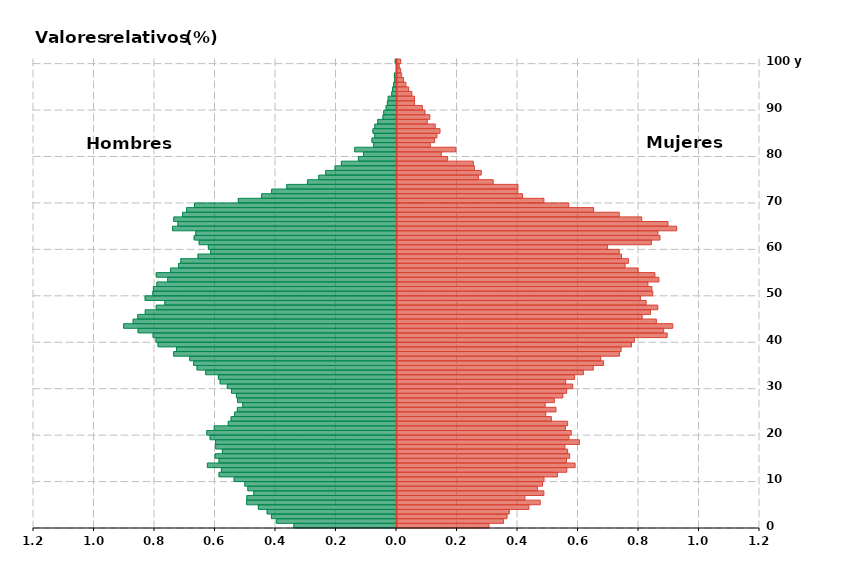
| Category | Hombres | Mujeres |
|---|---|---|
| 0 | -0.339 | 0.304 |
| 1 | -0.397 | 0.352 |
| 2 | -0.413 | 0.364 |
| 3 | -0.428 | 0.371 |
| 4 | -0.457 | 0.436 |
| 5 | -0.496 | 0.473 |
| 6 | -0.494 | 0.423 |
| 7 | -0.472 | 0.486 |
| 8 | -0.491 | 0.464 |
| 9 | -0.501 | 0.481 |
| 10 | -0.537 | 0.486 |
| 11 | -0.587 | 0.53 |
| 12 | -0.579 | 0.561 |
| 13 | -0.625 | 0.589 |
| 14 | -0.587 | 0.56 |
| 15 | -0.6 | 0.571 |
| 16 | -0.576 | 0.564 |
| 17 | -0.598 | 0.555 |
| 18 | -0.598 | 0.603 |
| 19 | -0.616 | 0.568 |
| 20 | -0.627 | 0.576 |
| 21 | -0.602 | 0.557 |
| 22 | -0.556 | 0.564 |
| 23 | -0.547 | 0.51 |
| 24 | -0.535 | 0.492 |
| 25 | -0.526 | 0.526 |
| 26 | -0.508 | 0.49 |
| 27 | -0.526 | 0.52 |
| 28 | -0.529 | 0.548 |
| 29 | -0.546 | 0.561 |
| 30 | -0.559 | 0.581 |
| 31 | -0.583 | 0.558 |
| 32 | -0.589 | 0.587 |
| 33 | -0.631 | 0.616 |
| 34 | -0.659 | 0.649 |
| 35 | -0.67 | 0.683 |
| 36 | -0.684 | 0.674 |
| 37 | -0.737 | 0.736 |
| 38 | -0.727 | 0.741 |
| 39 | -0.788 | 0.775 |
| 40 | -0.795 | 0.785 |
| 41 | -0.805 | 0.893 |
| 42 | -0.854 | 0.882 |
| 43 | -0.902 | 0.912 |
| 44 | -0.87 | 0.857 |
| 45 | -0.855 | 0.81 |
| 46 | -0.83 | 0.838 |
| 47 | -0.794 | 0.862 |
| 48 | -0.766 | 0.824 |
| 49 | -0.831 | 0.805 |
| 50 | -0.806 | 0.846 |
| 51 | -0.804 | 0.843 |
| 52 | -0.792 | 0.829 |
| 53 | -0.756 | 0.866 |
| 54 | -0.794 | 0.853 |
| 55 | -0.747 | 0.797 |
| 56 | -0.72 | 0.754 |
| 57 | -0.713 | 0.765 |
| 58 | -0.656 | 0.742 |
| 59 | -0.615 | 0.735 |
| 60 | -0.622 | 0.696 |
| 61 | -0.652 | 0.841 |
| 62 | -0.669 | 0.869 |
| 63 | -0.664 | 0.863 |
| 64 | -0.74 | 0.925 |
| 65 | -0.723 | 0.896 |
| 66 | -0.736 | 0.809 |
| 67 | -0.707 | 0.735 |
| 68 | -0.694 | 0.65 |
| 69 | -0.668 | 0.568 |
| 70 | -0.523 | 0.486 |
| 71 | -0.446 | 0.415 |
| 72 | -0.413 | 0.399 |
| 73 | -0.363 | 0.4 |
| 74 | -0.294 | 0.318 |
| 75 | -0.257 | 0.269 |
| 76 | -0.234 | 0.279 |
| 77 | -0.203 | 0.256 |
| 78 | -0.182 | 0.252 |
| 79 | -0.126 | 0.167 |
| 80 | -0.109 | 0.146 |
| 81 | -0.138 | 0.194 |
| 82 | -0.075 | 0.11 |
| 83 | -0.081 | 0.124 |
| 84 | -0.072 | 0.132 |
| 85 | -0.078 | 0.142 |
| 86 | -0.072 | 0.126 |
| 87 | -0.062 | 0.1 |
| 88 | -0.045 | 0.108 |
| 89 | -0.042 | 0.093 |
| 90 | -0.034 | 0.084 |
| 91 | -0.03 | 0.058 |
| 92 | -0.027 | 0.058 |
| 93 | -0.016 | 0.049 |
| 94 | -0.013 | 0.038 |
| 95 | -0.009 | 0.029 |
| 96 | -0.006 | 0.022 |
| 97 | -0.007 | 0.015 |
| 98 | -0.001 | 0.012 |
| 99 | -0.001 | 0.007 |
| 100 | -0.004 | 0.012 |